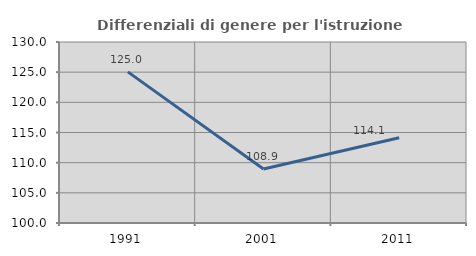
| Category | Differenziali di genere per l'istruzione superiore |
|---|---|
| 1991.0 | 125.049 |
| 2001.0 | 108.938 |
| 2011.0 | 114.117 |